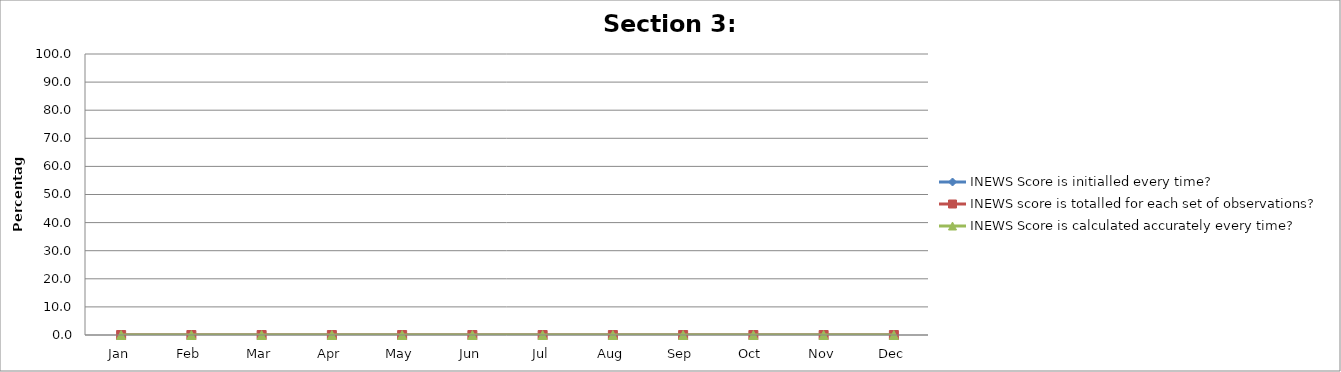
| Category | INEWS Score is initialled every time? | INEWS score is totalled for each set of observations? | INEWS Score is calculated accurately every time? |
|---|---|---|---|
| Jan | 0 | 0 | 0 |
| Feb | 0 | 0 | 0 |
| Mar | 0 | 0 | 0 |
| Apr | 0 | 0 | 0 |
| May | 0 | 0 | 0 |
| Jun | 0 | 0 | 0 |
| Jul | 0 | 0 | 0 |
| Aug | 0 | 0 | 0 |
| Sep | 0 | 0 | 0 |
| Oct | 0 | 0 | 0 |
| Nov | 0 | 0 | 0 |
| Dec | 0 | 0 | 0 |